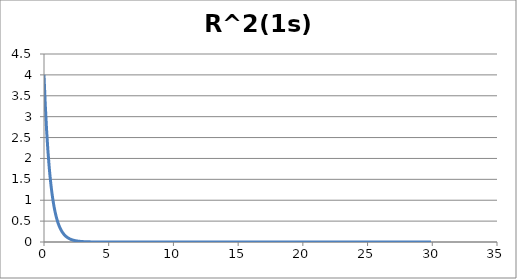
| Category | R^2(1s) |
|---|---|
| 0.0 | 4 |
| 0.1 | 3.275 |
| 0.2 | 2.681 |
| 0.30000000000000004 | 2.195 |
| 0.4 | 1.797 |
| 0.5 | 1.472 |
| 0.6 | 1.205 |
| 0.7 | 0.986 |
| 0.7999999999999999 | 0.808 |
| 0.8999999999999999 | 0.661 |
| 0.9999999999999999 | 0.541 |
| 1.0999999999999999 | 0.443 |
| 1.2 | 0.363 |
| 1.3 | 0.297 |
| 1.4000000000000001 | 0.243 |
| 1.5000000000000002 | 0.199 |
| 1.6000000000000003 | 0.163 |
| 1.7000000000000004 | 0.133 |
| 1.8000000000000005 | 0.109 |
| 1.9000000000000006 | 0.089 |
| 2.0000000000000004 | 0.073 |
| 2.1000000000000005 | 0.06 |
| 2.2000000000000006 | 0.049 |
| 2.3000000000000007 | 0.04 |
| 2.400000000000001 | 0.033 |
| 2.500000000000001 | 0.027 |
| 2.600000000000001 | 0.022 |
| 2.700000000000001 | 0.018 |
| 2.800000000000001 | 0.015 |
| 2.9000000000000012 | 0.012 |
| 3.0000000000000013 | 0.01 |
| 3.1000000000000014 | 0.008 |
| 3.2000000000000015 | 0.007 |
| 3.3000000000000016 | 0.005 |
| 3.4000000000000017 | 0.004 |
| 3.5000000000000018 | 0.004 |
| 3.600000000000002 | 0.003 |
| 3.700000000000002 | 0.002 |
| 3.800000000000002 | 0.002 |
| 3.900000000000002 | 0.002 |
| 4.000000000000002 | 0.001 |
| 4.100000000000001 | 0.001 |
| 4.200000000000001 | 0.001 |
| 4.300000000000001 | 0.001 |
| 4.4 | 0.001 |
| 4.5 | 0 |
| 4.6 | 0 |
| 4.699999999999999 | 0 |
| 4.799999999999999 | 0 |
| 4.899999999999999 | 0 |
| 4.999999999999998 | 0 |
| 5.099999999999998 | 0 |
| 5.1999999999999975 | 0 |
| 5.299999999999997 | 0 |
| 5.399999999999997 | 0 |
| 5.4999999999999964 | 0 |
| 5.599999999999996 | 0 |
| 5.699999999999996 | 0 |
| 5.799999999999995 | 0 |
| 5.899999999999995 | 0 |
| 5.999999999999995 | 0 |
| 6.099999999999994 | 0 |
| 6.199999999999994 | 0 |
| 6.299999999999994 | 0 |
| 6.399999999999993 | 0 |
| 6.499999999999993 | 0 |
| 6.5999999999999925 | 0 |
| 6.699999999999992 | 0 |
| 6.799999999999992 | 0 |
| 6.8999999999999915 | 0 |
| 6.999999999999991 | 0 |
| 7.099999999999991 | 0 |
| 7.19999999999999 | 0 |
| 7.29999999999999 | 0 |
| 7.39999999999999 | 0 |
| 7.499999999999989 | 0 |
| 7.599999999999989 | 0 |
| 7.699999999999989 | 0 |
| 7.799999999999988 | 0 |
| 7.899999999999988 | 0 |
| 7.999999999999988 | 0 |
| 8.099999999999987 | 0 |
| 8.199999999999987 | 0 |
| 8.299999999999986 | 0 |
| 8.399999999999986 | 0 |
| 8.499999999999986 | 0 |
| 8.599999999999985 | 0 |
| 8.699999999999985 | 0 |
| 8.799999999999985 | 0 |
| 8.899999999999984 | 0 |
| 8.999999999999984 | 0 |
| 9.099999999999984 | 0 |
| 9.199999999999983 | 0 |
| 9.299999999999983 | 0 |
| 9.399999999999983 | 0 |
| 9.499999999999982 | 0 |
| 9.599999999999982 | 0 |
| 9.699999999999982 | 0 |
| 9.799999999999981 | 0 |
| 9.89999999999998 | 0 |
| 9.99999999999998 | 0 |
| 10.09999999999998 | 0 |
| 10.19999999999998 | 0 |
| 10.29999999999998 | 0 |
| 10.399999999999979 | 0 |
| 10.499999999999979 | 0 |
| 10.599999999999978 | 0 |
| 10.699999999999978 | 0 |
| 10.799999999999978 | 0 |
| 10.899999999999977 | 0 |
| 10.999999999999977 | 0 |
| 11.099999999999977 | 0 |
| 11.199999999999976 | 0 |
| 11.299999999999976 | 0 |
| 11.399999999999975 | 0 |
| 11.499999999999975 | 0 |
| 11.599999999999975 | 0 |
| 11.699999999999974 | 0 |
| 11.799999999999974 | 0 |
| 11.899999999999974 | 0 |
| 11.999999999999973 | 0 |
| 12.099999999999973 | 0 |
| 12.199999999999973 | 0 |
| 12.299999999999972 | 0 |
| 12.399999999999972 | 0 |
| 12.499999999999972 | 0 |
| 12.599999999999971 | 0 |
| 12.69999999999997 | 0 |
| 12.79999999999997 | 0 |
| 12.89999999999997 | 0 |
| 12.99999999999997 | 0 |
| 13.09999999999997 | 0 |
| 13.199999999999969 | 0 |
| 13.299999999999969 | 0 |
| 13.399999999999968 | 0 |
| 13.499999999999968 | 0 |
| 13.599999999999968 | 0 |
| 13.699999999999967 | 0 |
| 13.799999999999967 | 0 |
| 13.899999999999967 | 0 |
| 13.999999999999966 | 0 |
| 14.099999999999966 | 0 |
| 14.199999999999966 | 0 |
| 14.299999999999965 | 0 |
| 14.399999999999965 | 0 |
| 14.499999999999964 | 0 |
| 14.599999999999964 | 0 |
| 14.699999999999964 | 0 |
| 14.799999999999963 | 0 |
| 14.899999999999963 | 0 |
| 14.999999999999963 | 0 |
| 15.099999999999962 | 0 |
| 15.199999999999962 | 0 |
| 15.299999999999962 | 0 |
| 15.399999999999961 | 0 |
| 15.499999999999961 | 0 |
| 15.59999999999996 | 0 |
| 15.69999999999996 | 0 |
| 15.79999999999996 | 0 |
| 15.89999999999996 | 0 |
| 15.99999999999996 | 0 |
| 16.09999999999996 | 0 |
| 16.19999999999996 | 0 |
| 16.29999999999996 | 0 |
| 16.399999999999963 | 0 |
| 16.499999999999964 | 0 |
| 16.599999999999966 | 0 |
| 16.699999999999967 | 0 |
| 16.79999999999997 | 0 |
| 16.89999999999997 | 0 |
| 16.99999999999997 | 0 |
| 17.099999999999973 | 0 |
| 17.199999999999974 | 0 |
| 17.299999999999976 | 0 |
| 17.399999999999977 | 0 |
| 17.49999999999998 | 0 |
| 17.59999999999998 | 0 |
| 17.69999999999998 | 0 |
| 17.799999999999983 | 0 |
| 17.899999999999984 | 0 |
| 17.999999999999986 | 0 |
| 18.099999999999987 | 0 |
| 18.19999999999999 | 0 |
| 18.29999999999999 | 0 |
| 18.39999999999999 | 0 |
| 18.499999999999993 | 0 |
| 18.599999999999994 | 0 |
| 18.699999999999996 | 0 |
| 18.799999999999997 | 0 |
| 18.9 | 0 |
| 19.0 | 0 |
| 19.1 | 0 |
| 19.200000000000003 | 0 |
| 19.300000000000004 | 0 |
| 19.400000000000006 | 0 |
| 19.500000000000007 | 0 |
| 19.60000000000001 | 0 |
| 19.70000000000001 | 0 |
| 19.80000000000001 | 0 |
| 19.900000000000013 | 0 |
| 20.000000000000014 | 0 |
| 20.100000000000016 | 0 |
| 20.200000000000017 | 0 |
| 20.30000000000002 | 0 |
| 20.40000000000002 | 0 |
| 20.50000000000002 | 0 |
| 20.600000000000023 | 0 |
| 20.700000000000024 | 0 |
| 20.800000000000026 | 0 |
| 20.900000000000027 | 0 |
| 21.00000000000003 | 0 |
| 21.10000000000003 | 0 |
| 21.20000000000003 | 0 |
| 21.300000000000033 | 0 |
| 21.400000000000034 | 0 |
| 21.500000000000036 | 0 |
| 21.600000000000037 | 0 |
| 21.70000000000004 | 0 |
| 21.80000000000004 | 0 |
| 21.90000000000004 | 0 |
| 22.000000000000043 | 0 |
| 22.100000000000044 | 0 |
| 22.200000000000045 | 0 |
| 22.300000000000047 | 0 |
| 22.40000000000005 | 0 |
| 22.50000000000005 | 0 |
| 22.60000000000005 | 0 |
| 22.700000000000053 | 0 |
| 22.800000000000054 | 0 |
| 22.900000000000055 | 0 |
| 23.000000000000057 | 0 |
| 23.10000000000006 | 0 |
| 23.20000000000006 | 0 |
| 23.30000000000006 | 0 |
| 23.400000000000063 | 0 |
| 23.500000000000064 | 0 |
| 23.600000000000065 | 0 |
| 23.700000000000067 | 0 |
| 23.800000000000068 | 0 |
| 23.90000000000007 | 0 |
| 24.00000000000007 | 0 |
| 24.100000000000072 | 0 |
| 24.200000000000074 | 0 |
| 24.300000000000075 | 0 |
| 24.400000000000077 | 0 |
| 24.500000000000078 | 0 |
| 24.60000000000008 | 0 |
| 24.70000000000008 | 0 |
| 24.800000000000082 | 0 |
| 24.900000000000084 | 0 |
| 25.000000000000085 | 0 |
| 25.100000000000087 | 0 |
| 25.200000000000088 | 0 |
| 25.30000000000009 | 0 |
| 25.40000000000009 | 0 |
| 25.500000000000092 | 0 |
| 25.600000000000094 | 0 |
| 25.700000000000095 | 0 |
| 25.800000000000097 | 0 |
| 25.900000000000098 | 0 |
| 26.0000000000001 | 0 |
| 26.1000000000001 | 0 |
| 26.200000000000102 | 0 |
| 26.300000000000104 | 0 |
| 26.400000000000105 | 0 |
| 26.500000000000107 | 0 |
| 26.600000000000108 | 0 |
| 26.70000000000011 | 0 |
| 26.80000000000011 | 0 |
| 26.900000000000112 | 0 |
| 27.000000000000114 | 0 |
| 27.100000000000115 | 0 |
| 27.200000000000117 | 0 |
| 27.300000000000118 | 0 |
| 27.40000000000012 | 0 |
| 27.50000000000012 | 0 |
| 27.600000000000122 | 0 |
| 27.700000000000124 | 0 |
| 27.800000000000125 | 0 |
| 27.900000000000126 | 0 |
| 28.000000000000128 | 0 |
| 28.10000000000013 | 0 |
| 28.20000000000013 | 0 |
| 28.300000000000132 | 0 |
| 28.400000000000134 | 0 |
| 28.500000000000135 | 0 |
| 28.600000000000136 | 0 |
| 28.700000000000138 | 0 |
| 28.80000000000014 | 0 |
| 28.90000000000014 | 0 |
| 29.000000000000142 | 0 |
| 29.100000000000144 | 0 |
| 29.200000000000145 | 0 |
| 29.300000000000146 | 0 |
| 29.400000000000148 | 0 |
| 29.50000000000015 | 0 |
| 29.60000000000015 | 0 |
| 29.700000000000152 | 0 |
| 29.800000000000153 | 0 |
| 29.900000000000155 | 0 |